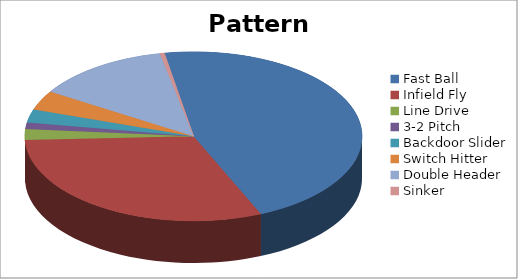
| Category | Pattern Distribution |
|---|---|
| Fast Ball | 111 |
| Infield Fly | 74 |
| Line Drive | 5 |
| 3-2 Pitch | 3 |
| Backdoor Slider | 6 |
| Switch Hitter | 9 |
| Double Header | 31 |
| Sinker | 1 |